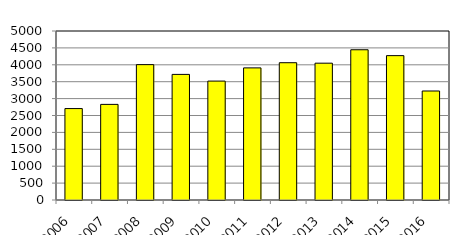
| Category | Ver- äußer-ungs- fälle |
|---|---|
| 2006 | 2705 |
| 2007 | 2829 |
| 2008 | 4005 |
| 2009 | 3716 |
| 2010 | 3518 |
| 2011 | 3909 |
| 2012 | 4062 |
| 2013 | 4048 |
| 2014 | 4445 |
| 2015 | 4271 |
| 2016 | 3225 |